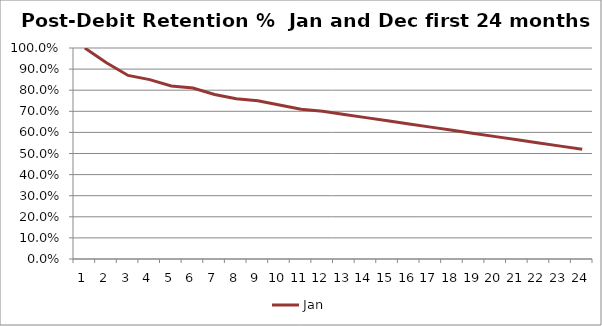
| Category | Jan | Dec |
|---|---|---|
| 0 | 1 |  |
| 1 | 0.93 |  |
| 2 | 0.87 |  |
| 3 | 0.85 |  |
| 4 | 0.82 |  |
| 5 | 0.81 |  |
| 6 | 0.78 |  |
| 7 | 0.76 |  |
| 8 | 0.75 |  |
| 9 | 0.73 |  |
| 10 | 0.71 |  |
| 11 | 0.7 |  |
| 12 | 0.685 |  |
| 13 | 0.67 |  |
| 14 | 0.655 |  |
| 15 | 0.64 |  |
| 16 | 0.625 |  |
| 17 | 0.61 |  |
| 18 | 0.595 |  |
| 19 | 0.58 |  |
| 20 | 0.565 |  |
| 21 | 0.55 |  |
| 22 | 0.535 |  |
| 23 | 0.52 |  |